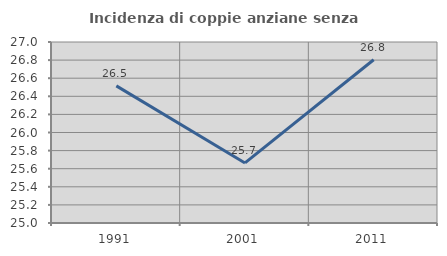
| Category | Incidenza di coppie anziane senza figli  |
|---|---|
| 1991.0 | 26.515 |
| 2001.0 | 25.664 |
| 2011.0 | 26.804 |